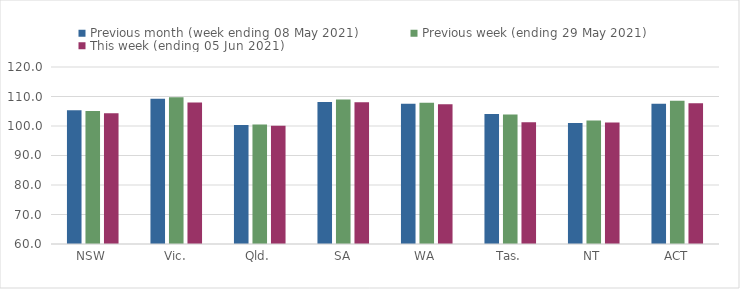
| Category | Previous month (week ending 08 May 2021) | Previous week (ending 29 May 2021) | This week (ending 05 Jun 2021) |
|---|---|---|---|
| NSW | 105.38 | 105.11 | 104.28 |
| Vic. | 109.24 | 109.76 | 107.97 |
| Qld. | 100.33 | 100.49 | 100.06 |
| SA | 108.13 | 109.01 | 108.04 |
| WA | 107.57 | 107.85 | 107.34 |
| Tas. | 104.04 | 103.9 | 101.23 |
| NT | 101.05 | 101.84 | 101.21 |
| ACT | 107.58 | 108.56 | 107.67 |